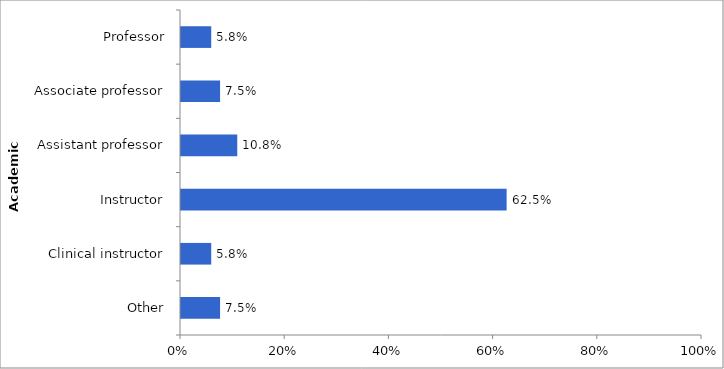
| Category | Series 0 |
|---|---|
| Other | 0.075 |
| Clinical instructor | 0.058 |
| Instructor | 0.625 |
| Assistant professor | 0.108 |
| Associate professor | 0.075 |
| Professor | 0.058 |